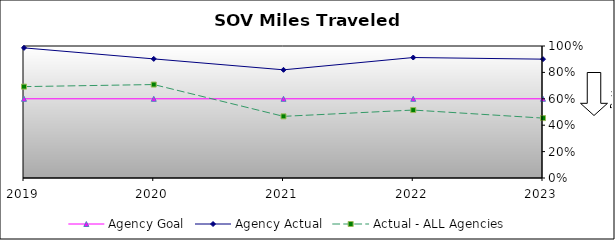
| Category | Agency Goal | Agency Actual | Actual - ALL Agencies |
|---|---|---|---|
| 2019.0 | 0.6 | 0.986 | 0.692 |
| 2020.0 | 0.6 | 0.902 | 0.708 |
| 2021.0 | 0.6 | 0.82 | 0.467 |
| 2022.0 | 0.6 | 0.913 | 0.515 |
| 2023.0 | 0.6 | 0.9 | 0.454 |